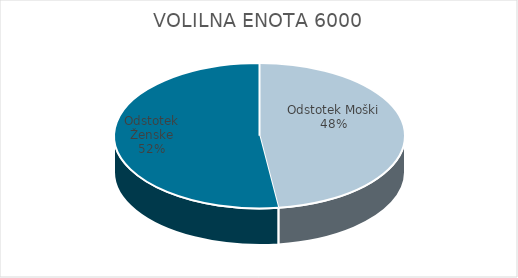
| Category | VOLILNA ENOTA 6000 | #REF! | Slovenija skupaj |
|---|---|---|---|
| Odstotek Moški | 24.27 |  | 24.13 |
| Odstotek Ženske | 26.36 |  | 27.06 |